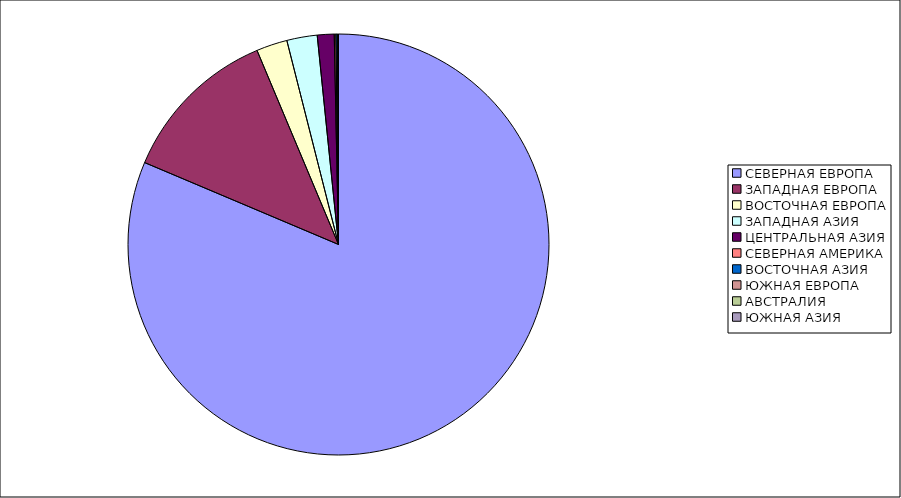
| Category | Оборот |
|---|---|
| СЕВЕРНАЯ ЕВРОПА | 81.363 |
| ЗАПАДНАЯ ЕВРОПА | 12.311 |
| ВОСТОЧНАЯ ЕВРОПА | 2.378 |
| ЗАПАДНАЯ АЗИЯ | 2.332 |
| ЦЕНТРАЛЬНАЯ АЗИЯ | 1.294 |
| СЕВЕРНАЯ АМЕРИКА | 0.122 |
| ВОСТОЧНАЯ АЗИЯ | 0.113 |
| ЮЖНАЯ ЕВРОПА | 0.084 |
| АВСТРАЛИЯ | 0.004 |
| ЮЖНАЯ АЗИЯ | 0 |